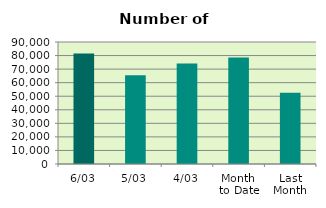
| Category | Series 0 |
|---|---|
| 6/03 | 81496 |
| 5/03 | 65442 |
| 4/03 | 74070 |
| Month 
to Date | 78480.8 |
| Last
Month | 52501.6 |